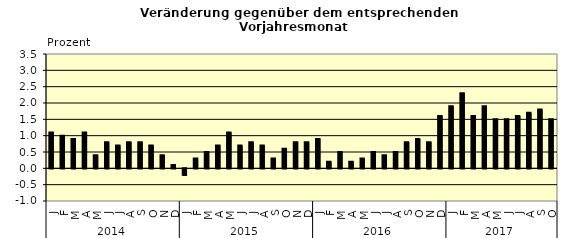
| Category | Series 0 |
|---|---|
| 0 | 1.1 |
| 1 | 1 |
| 2 | 0.9 |
| 3 | 1.1 |
| 4 | 0.4 |
| 5 | 0.8 |
| 6 | 0.7 |
| 7 | 0.8 |
| 8 | 0.8 |
| 9 | 0.7 |
| 10 | 0.4 |
| 11 | 0.1 |
| 12 | -0.2 |
| 13 | 0.3 |
| 14 | 0.5 |
| 15 | 0.7 |
| 16 | 1.1 |
| 17 | 0.7 |
| 18 | 0.8 |
| 19 | 0.7 |
| 20 | 0.3 |
| 21 | 0.6 |
| 22 | 0.8 |
| 23 | 0.8 |
| 24 | 0.9 |
| 25 | 0.2 |
| 26 | 0.5 |
| 27 | 0.2 |
| 28 | 0.3 |
| 29 | 0.5 |
| 30 | 0.4 |
| 31 | 0.5 |
| 32 | 0.8 |
| 33 | 0.9 |
| 34 | 0.8 |
| 35 | 1.6 |
| 36 | 1.9 |
| 37 | 2.3 |
| 38 | 1.6 |
| 39 | 1.9 |
| 40 | 1.5 |
| 41 | 1.5 |
| 42 | 1.6 |
| 43 | 1.7 |
| 44 | 1.8 |
| 45 | 1.5 |